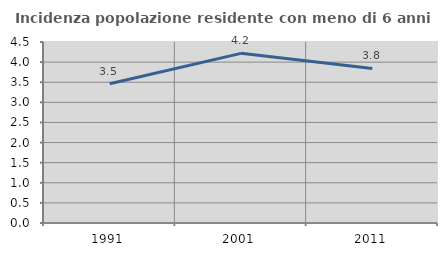
| Category | Incidenza popolazione residente con meno di 6 anni |
|---|---|
| 1991.0 | 3.464 |
| 2001.0 | 4.218 |
| 2011.0 | 3.842 |